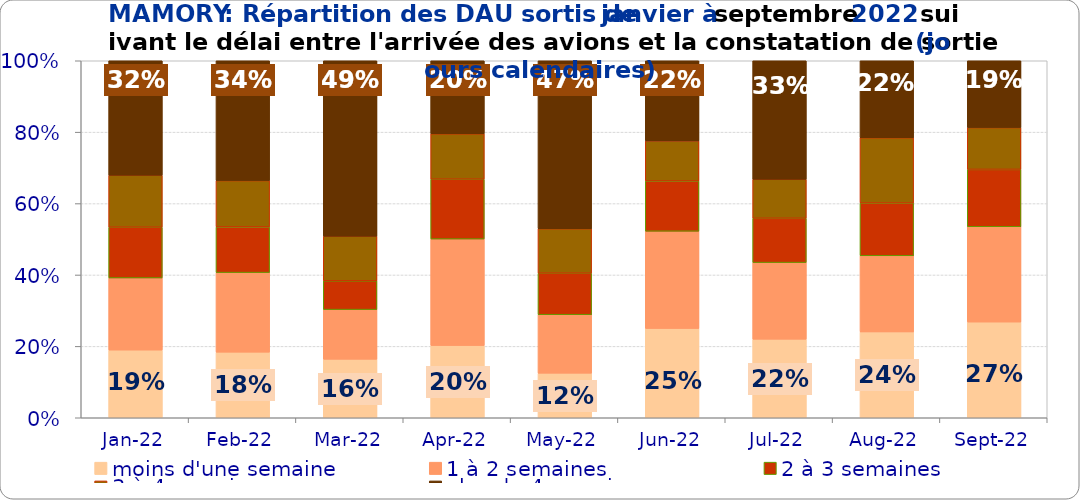
| Category | moins d'une semaine | 1 à 2 semaines | 2 à 3 semaines | 3 à 4 semaines | plus de 4 semaines |
|---|---|---|---|---|---|
| 2022-01-01 | 0.189 | 0.202 | 0.142 | 0.146 | 0.321 |
| 2022-02-01 | 0.184 | 0.223 | 0.128 | 0.13 | 0.336 |
| 2022-03-01 | 0.164 | 0.139 | 0.081 | 0.125 | 0.491 |
| 2022-04-01 | 0.202 | 0.298 | 0.168 | 0.127 | 0.205 |
| 2022-05-01 | 0.125 | 0.164 | 0.116 | 0.125 | 0.47 |
| 2022-06-01 | 0.25 | 0.272 | 0.141 | 0.112 | 0.224 |
| 2022-07-01 | 0.22 | 0.215 | 0.124 | 0.109 | 0.332 |
| 2022-08-01 | 0.24 | 0.213 | 0.148 | 0.183 | 0.216 |
| 2022-09-01 | 0.268 | 0.267 | 0.161 | 0.117 | 0.187 |